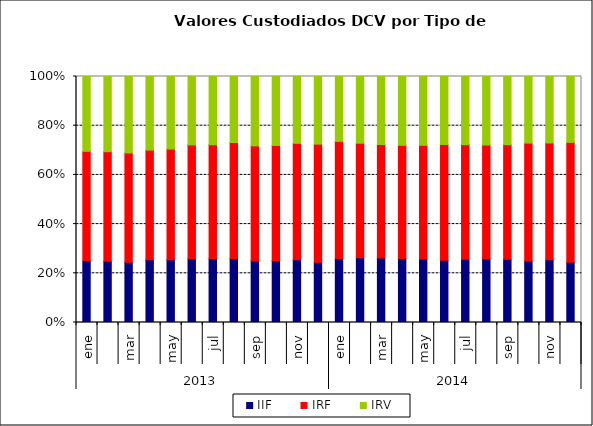
| Category | IIF | IRF | IRV |
|---|---|---|---|
| 0 | 81416.888 | 144757.513 | 98829.931 |
| 1 | 80087.618 | 143577.961 | 98462.561 |
| 2 | 78993.419 | 143324.923 | 100231.491 |
| 3 | 83785.228 | 146310.217 | 98211.779 |
| 4 | 78478.232 | 138557.629 | 90743.924 |
| 5 | 77408.288 | 138495.69 | 83206.996 |
| 6 | 76164.567 | 136530.894 | 81675.524 |
| 7 | 76924.923 | 139757.019 | 79486.55 |
| 8 | 76084.621 | 142512.819 | 85843.524 |
| 9 | 76192.422 | 141910.138 | 84955.045 |
| 10 | 73716.671 | 137078.942 | 78541.4 |
| 11 | 70472.419 | 138267.954 | 79143.198 |
| 12 | 71567.13 | 130707.048 | 72428.139 |
| 13 | 73037.524 | 128978.184 | 75132.114 |
| 14 | 73693.631 | 129795.063 | 77731.156 |
| 15 | 72217.535 | 127881.895 | 77628.794 |
| 16 | 74183.619 | 133039.706 | 80406.314 |
| 17 | 72454.93 | 134529.16 | 78989.531 |
| 18 | 71730.17 | 130252.528 | 77341.332 |
| 19 | 71033.229 | 127074.825 | 76395.904 |
| 20 | 70097.317 | 127041.722 | 75568.341 |
| 21 | 71382.521 | 137254.939 | 77399.09 |
| 22 | 71478.14 | 132842.886 | 75561.326 |
| 23 | 67109.708 | 133510.51 | 73395.251 |